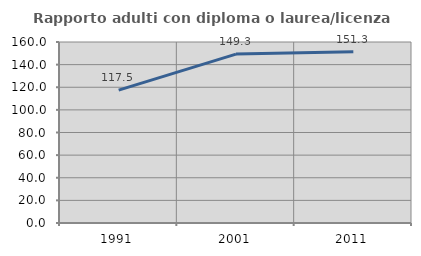
| Category | Rapporto adulti con diploma o laurea/licenza media  |
|---|---|
| 1991.0 | 117.501 |
| 2001.0 | 149.338 |
| 2011.0 | 151.295 |